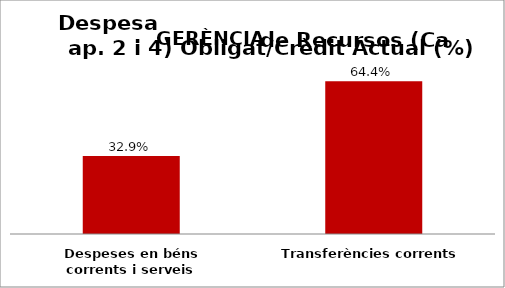
| Category | Series 0 |
|---|---|
| Despeses en béns corrents i serveis | 0.329 |
| Transferències corrents | 0.644 |